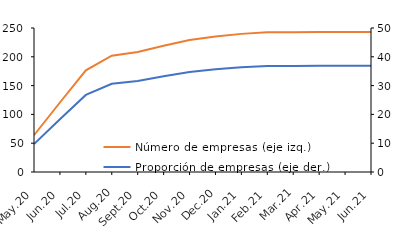
| Category | Número de empresas (eje izq.) |
|---|---|
| 2020-05-01 | 63.798 |
| 2020-06-01 | 120.662 |
| 2020-07-01 | 176.433 |
| 2020-08-01 | 201.963 |
| 2020-09-01 | 208.497 |
| 2020-10-01 | 219.014 |
| 2020-11-01 | 229.079 |
| 2020-12-01 | 235.245 |
| 2021-01-01 | 239.804 |
| 2021-02-01 | 242.61 |
| 2021-03-01 | 242.811 |
| 2021-04-01 | 242.935 |
| 2021-05-01 | 242.945 |
| 2021-06-01 | 242.954 |